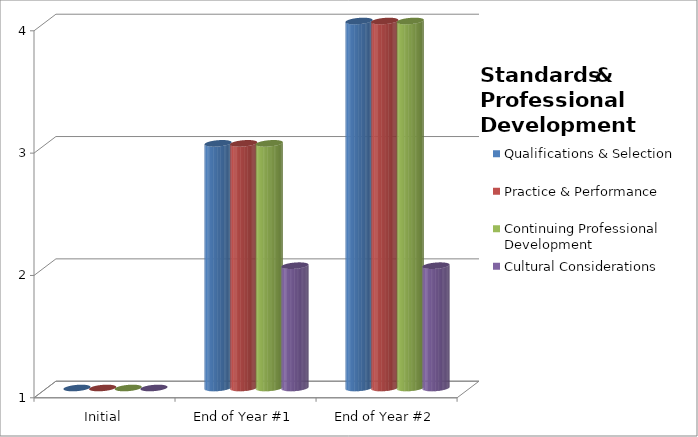
| Category | Qualifications & Selection  | Practice & Performance  | Continuing Professional Development  | Cultural Considerations  |
|---|---|---|---|---|
| Initial | 1 | 1 | 1 | 1 |
| End of Year #1 | 3 | 3 | 3 | 2 |
| End of Year #2 | 4 | 4 | 4 | 2 |